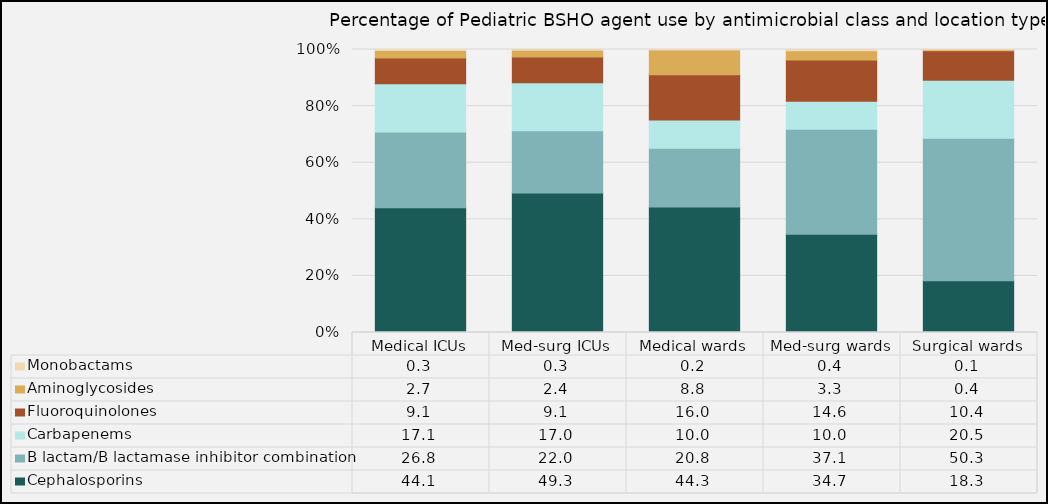
| Category | Cephalosporins | B lactam/B lactamase inhibitor combination | Carbapenems | Fluoroquinolones | Aminoglycosides | Monobactams |
|---|---|---|---|---|---|---|
| Medical ICUs | 44.05 | 26.82 | 17.06 | 9.08 | 2.67 | 0.31 |
| Med-surg ICUs | 49.26 | 22.01 | 16.97 | 9.13 | 2.35 | 0.28 |
| Medical wards | 44.34 | 20.78 | 9.95 | 15.98 | 8.76 | 0.19 |
| Med-surg wards | 34.68 | 37.12 | 9.95 | 14.57 | 3.29 | 0.4 |
| Surgical wards | 18.31 | 50.33 | 20.52 | 10.36 | 0.4 | 0.08 |